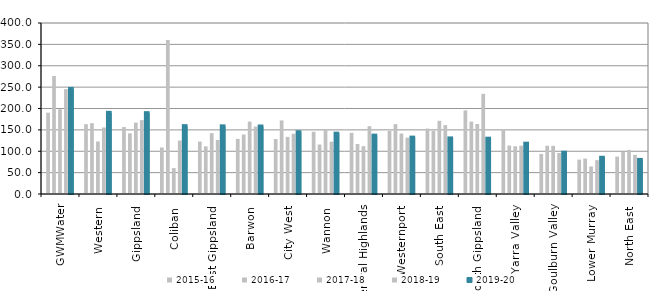
| Category | 2015-16 | 2016-17 | 2017-18 | 2018-19 | 2019-20 |
|---|---|---|---|---|---|
| GWMWater | 190.265 | 276.032 | 198.255 | 245.297 | 245.831 |
| Western  | 163.388 | 165.722 | 122.974 | 155.481 | 189.817 |
| Gippsland  | 156.66 | 141.977 | 167.081 | 172.801 | 189.135 |
| Coliban  | 108.784 | 360 | 60.543 | 124.935 | 158.741 |
| East Gippsland  | 122.658 | 111.377 | 142.403 | 126.374 | 158.246 |
| Barwon  | 128.97 | 139.243 | 169.387 | 157.723 | 157.855 |
| City West  | 128.548 | 172.071 | 133.611 | 140.986 | 144.446 |
| Wannon  | 145.493 | 115.775 | 150.822 | 122.348 | 141.117 |
| Central Highlands  | 143.001 | 117.03 | 111.895 | 158.693 | 136.502 |
| Westernport  | 147.669 | 163.449 | 141.492 | 131.803 | 131.888 |
| South East  | 153.019 | 148.064 | 171.116 | 161.137 | 130.01 |
| South Gippsland  | 195.73 | 169.429 | 163.803 | 234.275 | 129.384 |
| Yarra Valley  | 151.646 | 113.375 | 111.628 | 112.986 | 117.7 |
| Goulburn Valley  | 93.748 | 112.853 | 112.663 | 95.988 | 96.581 |
| Lower Murray  | 80.46 | 82.856 | 64.316 | 79.198 | 84.738 |
| North East  | 87.535 | 98.461 | 103.092 | 91.67 | 79.749 |